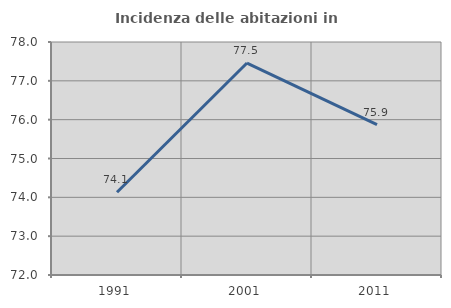
| Category | Incidenza delle abitazioni in proprietà  |
|---|---|
| 1991.0 | 74.129 |
| 2001.0 | 77.458 |
| 2011.0 | 75.87 |